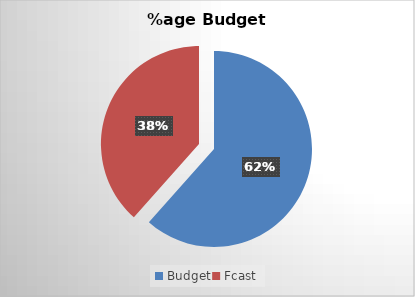
| Category | Series 0 |
|---|---|
| Budget | 1539.167 |
| Fcast | 960.833 |